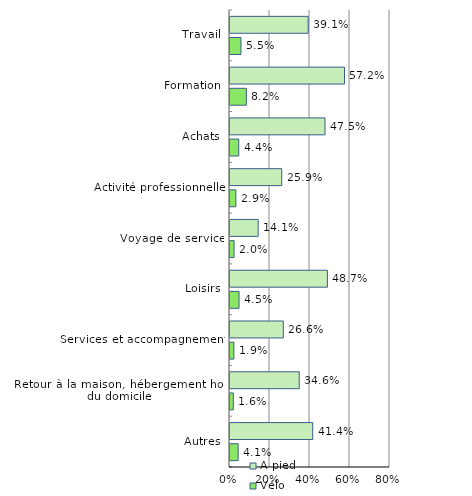
| Category | A pied | Vélo |
|---|---|---|
| Travail | 39.103 | 5.475 |
| Formation | 57.249 | 8.181 |
| Achats | 47.495 | 4.383 |
| Activité professionnelle | 25.862 | 2.929 |
| Voyage de service | 14.085 | 2.035 |
| Loisirs | 48.708 | 4.516 |
| Services et accompagnement | 26.649 | 1.936 |
| Retour à la maison, hébergement hors du domicile | 34.601 | 1.642 |
| Autres | 41.369 | 4.082 |